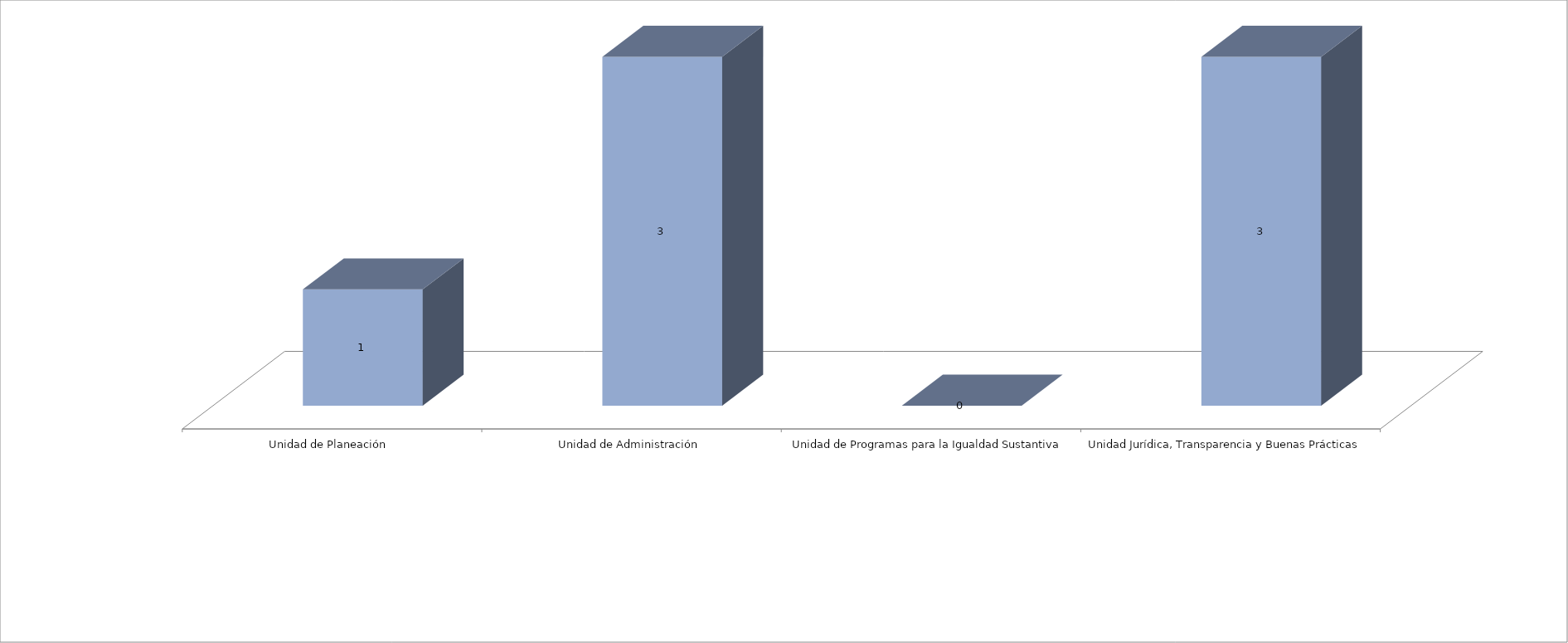
| Category | Series 0 | Series 1 |
|---|---|---|
| Unidad de Planeación  |  | 1 |
| Unidad de Administración |  | 3 |
| Unidad de Programas para la Igualdad Sustantiva |  | 0 |
| Unidad Jurídica, Transparencia y Buenas Prácticas  |  | 3 |